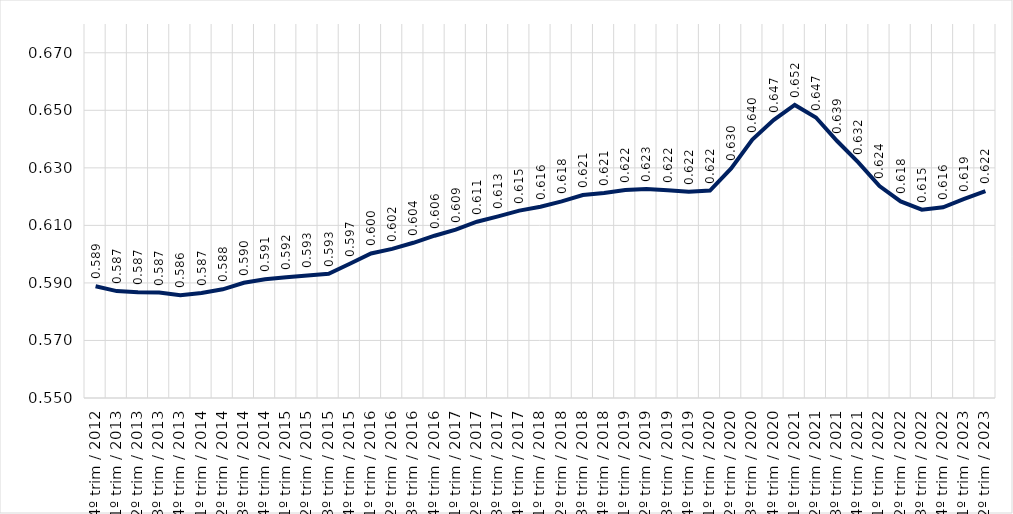
| Category | Conjunto RMs |
|---|---|
| 4º trim / 2012 | 0.589 |
| 1º trim / 2013 | 0.587 |
| 2º trim / 2013 | 0.587 |
| 3º trim / 2013 | 0.587 |
| 4º trim / 2013 | 0.586 |
| 1º trim / 2014 | 0.587 |
| 2º trim / 2014 | 0.588 |
| 3º trim / 2014 | 0.59 |
| 4º trim / 2014 | 0.591 |
| 1º trim / 2015 | 0.592 |
| 2º trim / 2015 | 0.593 |
| 3º trim / 2015 | 0.593 |
| 4º trim / 2015 | 0.597 |
| 1º trim / 2016 | 0.6 |
| 2º trim / 2016 | 0.602 |
| 3º trim / 2016 | 0.604 |
| 4º trim / 2016 | 0.606 |
| 1º trim / 2017 | 0.609 |
| 2º trim / 2017 | 0.611 |
| 3º trim / 2017 | 0.613 |
| 4º trim / 2017 | 0.615 |
| 1º trim / 2018 | 0.616 |
| 2º trim / 2018 | 0.618 |
| 3º trim / 2018 | 0.621 |
| 4º trim / 2018 | 0.621 |
| 1º trim / 2019 | 0.622 |
| 2º trim / 2019 | 0.623 |
| 3º trim / 2019 | 0.622 |
| 4º trim / 2019 | 0.622 |
| 1º trim / 2020 | 0.622 |
| 2º trim / 2020 | 0.63 |
| 3º trim / 2020 | 0.64 |
| 4º trim / 2020 | 0.647 |
| 1º trim / 2021 | 0.652 |
| 2º trim / 2021 | 0.647 |
| 3º trim / 2021 | 0.639 |
| 4º trim / 2021 | 0.632 |
| 1º trim / 2022 | 0.624 |
| 2º trim / 2022 | 0.618 |
| 3º trim / 2022 | 0.615 |
| 4º trim / 2022 | 0.616 |
| 1º trim / 2023 | 0.619 |
| 2º trim / 2023 | 0.622 |